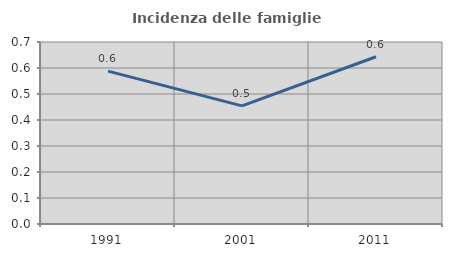
| Category | Incidenza delle famiglie numerose |
|---|---|
| 1991.0 | 0.588 |
| 2001.0 | 0.454 |
| 2011.0 | 0.643 |